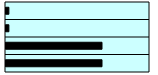
| Category | Series 0 |
|---|---|
| 0 | 0.02 |
| 1 | 0.02 |
| 2 | 0.667 |
| 3 | 0.667 |